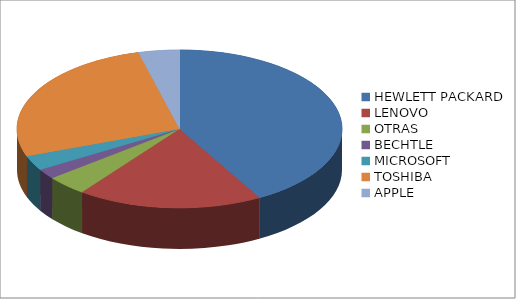
| Category | Series 0 |
|---|---|
| HEWLETT PACKARD | 41 |
| LENOVO | 18 |
| OTRAS | 4 |
| BECHTLE | 2 |
| MICROSOFT | 3 |
| TOSHIBA | 26 |
| APPLE | 4 |